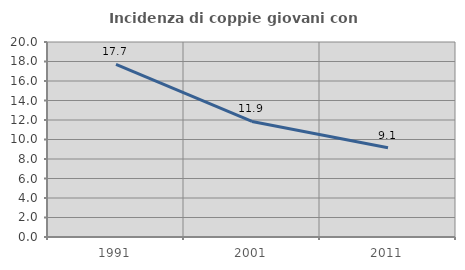
| Category | Incidenza di coppie giovani con figli |
|---|---|
| 1991.0 | 17.699 |
| 2001.0 | 11.852 |
| 2011.0 | 9.146 |